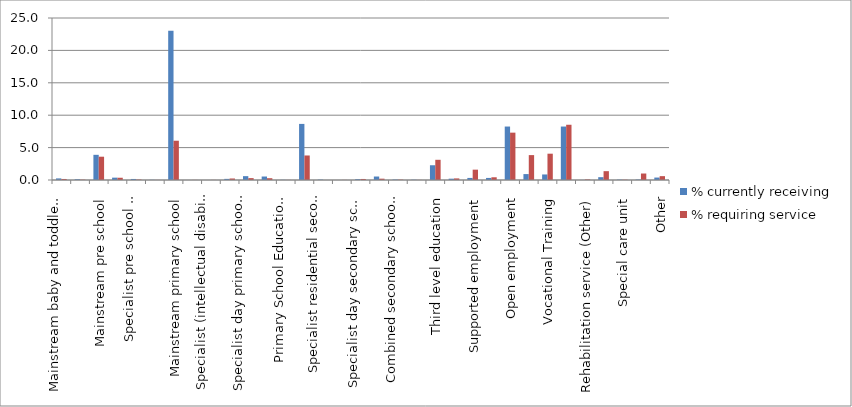
| Category | % currently receiving | % requiring service |
|---|---|---|
| Mainstream baby and toddler group | 0.246 | 0.159 |
| Specialist baby and toddler group | 0.116 | 0.058 |
| Mainstream pre school | 3.886 | 3.596 |
| Specialist pre school (physical and sensory disability) | 0.362 | 0.348 |
| Specialist pre school (intellectual disability) | 0.159 | 0.072 |
| Combined pre school (specialist and mainstream) | 0.029 | 0.014 |
| Mainstream primary school | 23.039 | 6.061 |
| Specialist residential primary school (physical and sensory disability) | 0 | 0.014 |
| Specialist (intellectual disability) residential primary school | 0 | 0.014 |
| Specialist day primary school (intellectual disability) | 0.174 | 0.232 |
| Specialist day primary school (physical and sensory disability) | 0.594 | 0.29 |
| Combined primary school (specialist and mainstream) | 0.536 | 0.275 |
| Primary School Education provided at home | 0.029 | 0.014 |
| Mainstream secondary school | 8.656 | 3.784 |
| Specialist residential secondary school (physical and sensory disability) | 0.058 | 0 |
| Specialist (intellectual disability) residential secondary school | 0 | 0.014 |
| Specialist day secondary school (intellectual disability) | 0.13 | 0.159 |
| Specialist day secondary school (physical and sensory disability) | 0.536 | 0.203 |
| Combined secondary school (specialist and mainstream) | 0.072 | 0.058 |
| Secondary school education provided at home | 0.043 | 0.014 |
| Third level education | 2.276 | 3.117 |
| Sheltered employment | 0.203 | 0.246 |
| Supported employment | 0.319 | 1.595 |
| Sheltered work | 0.319 | 0.42 |
| Open employment | 8.25 | 7.308 |
| Rehabilitative Training | 0.913 | 3.842 |
| Vocational Training | 0.855 | 4.06 |
| Day Activation Activity Services | 8.25 | 8.525 |
| Rehabilitation service (Other) | 0.014 | 0.087 |
| Rehabilitation service (physical and sensory disability) | 0.435 | 1.363 |
| Special care unit | 0.058 | 0.043 |
| Specialised day service for people with head injuries | 0.072 | 1 |
| Other | 0.377 | 0.594 |